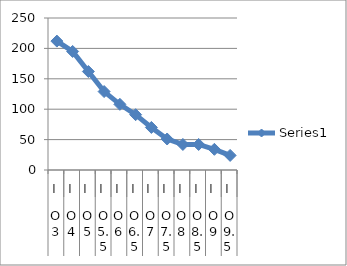
| Category | Series 0 |
|---|---|
| 0 | 212 |
| 1 | 195 |
| 2 | 162 |
| 3 | 129 |
| 4 | 108 |
| 5 | 91 |
| 6 | 70 |
| 7 | 51 |
| 8 | 42 |
| 9 | 42 |
| 10 | 34 |
| 11 | 24 |